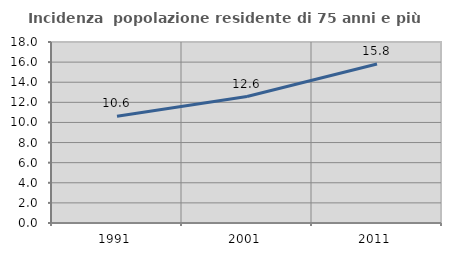
| Category | Incidenza  popolazione residente di 75 anni e più |
|---|---|
| 1991.0 | 10.614 |
| 2001.0 | 12.574 |
| 2011.0 | 15.818 |